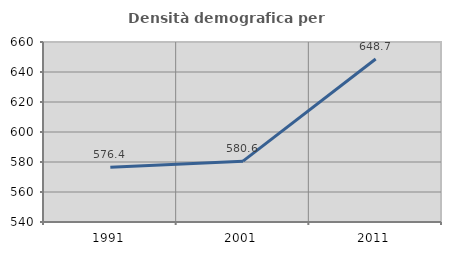
| Category | Densità demografica |
|---|---|
| 1991.0 | 576.433 |
| 2001.0 | 580.577 |
| 2011.0 | 648.705 |